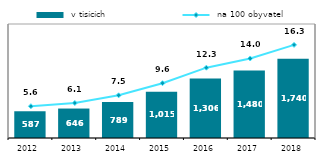
| Category |  v tisících |
|---|---|
| 2012.0 | 586.504 |
| 2013.0 | 646.04 |
| 2014.0 | 789.006 |
| 2015.0 | 1014.528 |
| 2016.0 | 1305.523 |
| 2017.0 | 1480.213 |
| 2018.0 | 1739.719 |